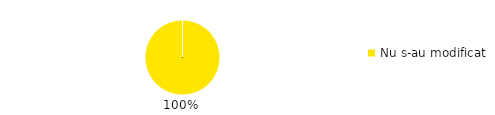
| Category | Total |
|---|---|
| Nu s-au modificat | 1 |